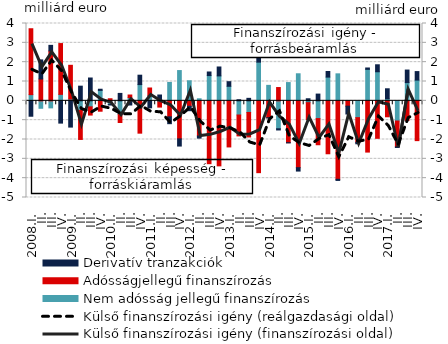
| Category | Nem adósság jellegű finanszírozás | Adósságjellegű finanszírozás | Derivatív tranzakciók |
|---|---|---|---|
| 2008.I. | 0.322 | 3.407 | -0.797 |
| II. | -0.385 | 1.131 | 0.986 |
| III. | -0.364 | 2.578 | 0.292 |
| IV. | 0.334 | 2.628 | -1.152 |
| 2009.I. | 0.096 | 1.742 | -1.358 |
| II. | -0.495 | -1.502 | 0.758 |
| III. | -0.31 | -0.426 | 1.181 |
| IV. | 0.54 | -0.537 | 0.06 |
| 2010.I. | -0.188 | 0.108 | -0.028 |
| II. | -0.709 | -0.411 | 0.384 |
| III. | 0.167 | 0.134 | -0.216 |
| IV. | 0.841 | -1.672 | 0.485 |
| 2011.I. | 0.279 | 0.384 | -0.362 |
| II. | -0.045 | -0.279 | 0.301 |
| III. | 0.951 | -0.827 | -0.355 |
| IV. | 1.566 | -1.967 | -0.372 |
| 2012.I. | 1.038 | -0.282 | -0.228 |
| II. | 0.107 | -1.816 | -0.112 |
| III. | 1.307 | -3.251 | 0.185 |
| IV. | 1.29 | -3.363 | 0.461 |
| 2013.I. | 0.752 | -2.385 | 0.238 |
| II. | -0.734 | -1.079 | 0.057 |
| III. | -0.601 | -1.268 | 0.129 |
| IV. | 2.002 | -3.715 | 0.193 |
| 2014.I. | 0.8 | -0.873 | -0.015 |
| II. | -1.445 | 0.687 | -0.062 |
| III. | 0.944 | -2.164 | -0.012 |
| IV. | 1.399 | -3.458 | -0.175 |
| 2015.I. | -0.094 | -0.877 | 0.108 |
| II. | -0.918 | -1.353 | 0.349 |
| III. | 1.228 | -2.738 | 0.289 |
| IV. | 1.396 | -4.058 | -0.059 |
| 2016.I. | 0.018 | -0.276 | -0.406 |
| II. | -0.87 | -1.275 | -0.078 |
| III. | 1.629 | -2.651 | 0.07 |
| IV. | 1.504 | -1.939 | 0.361 |
| 2017.I. | 0.109 | -0.825 | 0.515 |
| II. | -1.045 | -1.34 | -0.027 |
| III. | 0.943 | -1.011 | 0.649 |
| IV. | 1.073 | -2.059 | 0.44 |